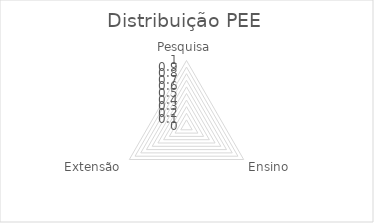
| Category | Series 0 |
|---|---|
| Pesquisa | 0 |
| Ensino | 0 |
| Extensão | 0 |